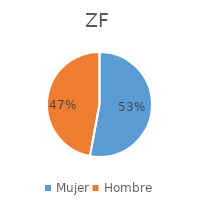
| Category | ZF |
|---|---|
| Mujer | 0.529 |
| Hombre | 0.471 |